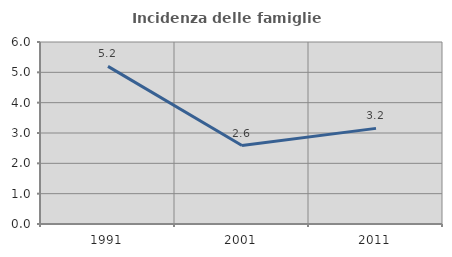
| Category | Incidenza delle famiglie numerose |
|---|---|
| 1991.0 | 5.195 |
| 2001.0 | 2.587 |
| 2011.0 | 3.152 |